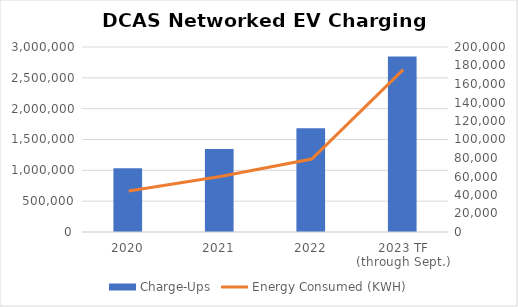
| Category | Charge-Ups |
|---|---|
| 2020 | 69001 |
| 2021 | 89802 |
| 2022 | 112042 |
| 2023 TF (through Sept.) | 189704 |